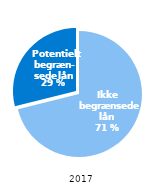
| Category | Series 0 |
|---|---|
| 0 | 0.711 |
| 1 | 0.289 |